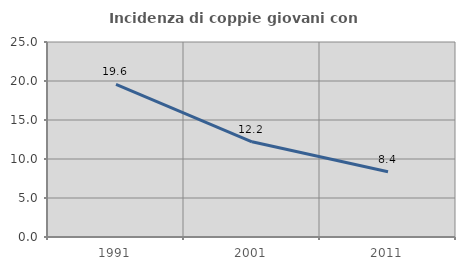
| Category | Incidenza di coppie giovani con figli |
|---|---|
| 1991.0 | 19.556 |
| 2001.0 | 12.209 |
| 2011.0 | 8.361 |